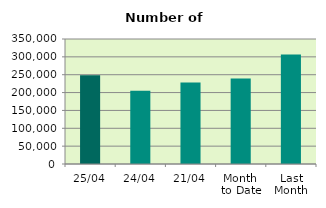
| Category | Series 0 |
|---|---|
| 25/04 | 248424 |
| 24/04 | 205194 |
| 21/04 | 228042 |
| Month 
to Date | 239224.429 |
| Last
Month | 306734.174 |